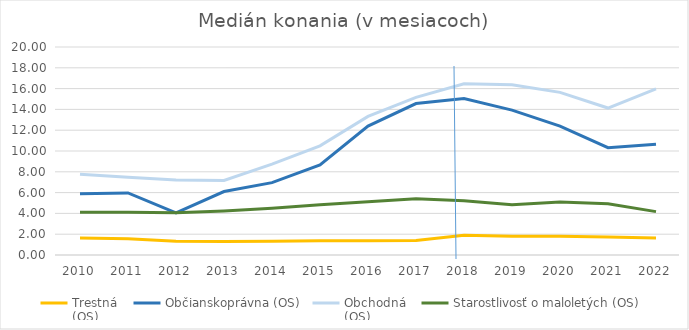
| Category | Trestná
(OS) | Občianskoprávna (OS) | Obchodná
(OS) | Starostlivosť o maloletých (OS) |
|---|---|---|---|---|
| 2010.0 | 1.63 | 5.9 | 7.77 | 4.1 |
| 2011.0 | 1.57 | 5.97 | 7.47 | 4.1 |
| 2012.0 | 1.33 | 4.06 | 7.2 | 4.06 |
| 2013.0 | 1.3 | 6.1 | 7.17 | 4.23 |
| 2014.0 | 1.33 | 6.96 | 8.73 | 4.5 |
| 2015.0 | 1.36 | 8.66 | 10.5 | 4.83 |
| 2016.0 | 1.36 | 12.4 | 13.33 | 5.13 |
| 2017.0 | 1.4 | 14.56 | 15.16 | 5.4 |
| 2018.0 | 1.91 | 15.05 | 16.46 | 5.22 |
| 2019.0 | 1.81 | 13.93 | 16.36 | 4.83 |
| 2020.0 | 1.81 | 12.39 | 15.64 | 5.09 |
| 2021.0 | 1.74 | 10.32 | 14.13 | 4.93 |
| 2022.0 | 1.64 | 10.64 | 15.97 | 4.17 |